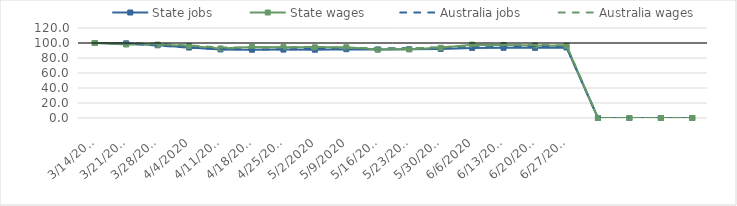
| Category | State jobs | State wages | Australia jobs | Australia wages |
|---|---|---|---|---|
| 14/03/2020 | 100 | 100 | 100 | 100 |
| 21/03/2020 | 99.57 | 98.007 | 99.389 | 100.07 |
| 28/03/2020 | 96.945 | 97.855 | 96.608 | 98.707 |
| 04/04/2020 | 93.955 | 96.008 | 93.828 | 96.765 |
| 11/04/2020 | 91.407 | 92.723 | 91.887 | 94.047 |
| 18/04/2020 | 91.032 | 94.642 | 91.31 | 93.932 |
| 25/04/2020 | 91.181 | 94.484 | 91.6 | 94.326 |
| 02/05/2020 | 91.035 | 94.229 | 91.954 | 94.889 |
| 09/05/2020 | 91.736 | 94.34 | 92.449 | 93.491 |
| 16/05/2020 | 91.369 | 91.293 | 92.97 | 93.144 |
| 23/05/2020 | 91.802 | 91.626 | 93.251 | 92.924 |
| 30/05/2020 | 92.125 | 93.553 | 93.813 | 94.361 |
| 06/06/2020 | 93.444 | 97.796 | 94.668 | 96.401 |
| 13/06/2020 | 93.639 | 97.418 | 95.11 | 97.158 |
| 20/06/2020 | 93.552 | 96.702 | 95.246 | 97.537 |
| 27/06/2020 | 94.077 | 96.375 | 94.328 | 96.826 |